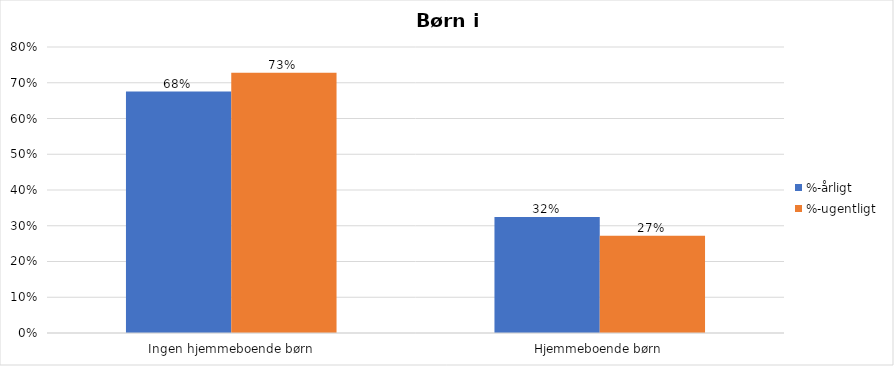
| Category | %-årligt | %-ugentligt |
|---|---|---|
| Ingen hjemmeboende børn | 0.675 | 0.728 |
| Hjemmeboende børn | 0.325 | 0.272 |